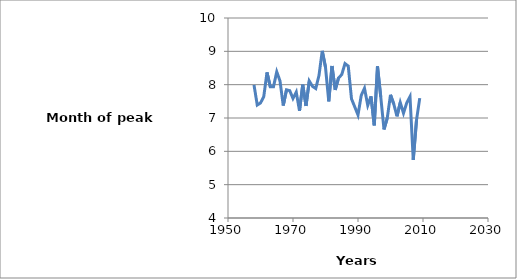
| Category | Series 0 |
|---|---|
| 1958.0 | 7.991 |
| 1959.0 | 7.39 |
| 1960.0 | 7.451 |
| 1961.0 | 7.64 |
| 1962.0 | 8.368 |
| 1963.0 | 7.94 |
| 1964.0 | 7.94 |
| 1965.0 | 8.386 |
| 1966.0 | 8.112 |
| 1967.0 | 7.374 |
| 1968.0 | 7.846 |
| 1969.0 | 7.819 |
| 1970.0 | 7.585 |
| 1971.0 | 7.778 |
| 1972.0 | 7.216 |
| 1973.0 | 7.999 |
| 1974.0 | 7.361 |
| 1975.0 | 8.112 |
| 1976.0 | 7.95 |
| 1977.0 | 7.883 |
| 1978.0 | 8.279 |
| 1979.0 | 9.014 |
| 1980.0 | 8.523 |
| 1981.0 | 7.502 |
| 1982.0 | 8.56 |
| 1983.0 | 7.841 |
| 1984.0 | 8.201 |
| 1985.0 | 8.302 |
| 1986.0 | 8.634 |
| 1987.0 | 8.558 |
| 1988.0 | 7.574 |
| 1989.0 | 7.335 |
| 1990.0 | 7.09 |
| 1991.0 | 7.679 |
| 1992.0 | 7.892 |
| 1993.0 | 7.38 |
| 1994.0 | 7.65 |
| 1995.0 | 6.78 |
| 1996.0 | 8.55 |
| 1997.0 | 7.634 |
| 1998.0 | 6.656 |
| 1999.0 | 6.997 |
| 2000.0 | 7.696 |
| 2001.0 | 7.421 |
| 2002.0 | 7.05 |
| 2003.0 | 7.464 |
| 2004.0 | 7.147 |
| 2005.0 | 7.457 |
| 2006.0 | 7.642 |
| 2007.0 | 5.743 |
| 2008.0 | 6.938 |
| 2009.0 | 7.596 |